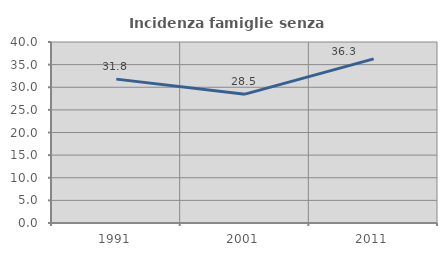
| Category | Incidenza famiglie senza nuclei |
|---|---|
| 1991.0 | 31.795 |
| 2001.0 | 28.472 |
| 2011.0 | 36.28 |